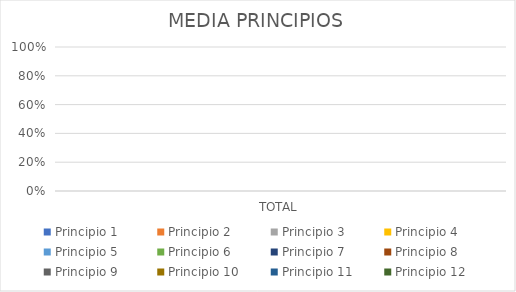
| Category | Principio 1 | Principio 2 | Principio 3 | Principio 4 | Principio 5 | Principio 6 | Principio 7 | Principio 8 | Principio 9 | Principio 10 | Principio 11 | Principio 12 |
|---|---|---|---|---|---|---|---|---|---|---|---|---|
| TOTAL | 0 | 0 | 0 | 0 | 0 | 0 | 0 | 0 | 0 | 0 | 0 | 0 |